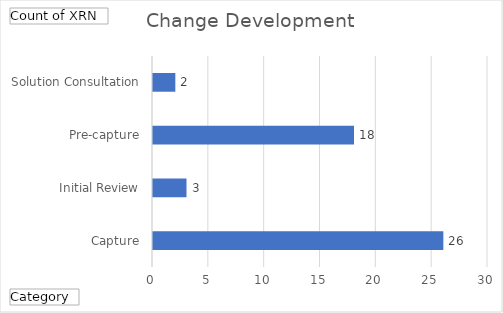
| Category | Total |
|---|---|
| Capture | 26 |
| Initial Review | 3 |
| Pre-capture | 18 |
| Solution Consultation | 2 |